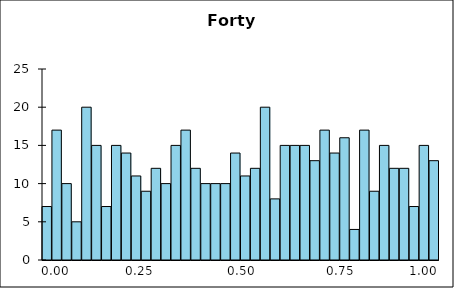
| Category | Series 1 |
|---|---|
| 0 | 7 |
| 1 | 17 |
| 2 | 10 |
| 3 | 5 |
| 4 | 20 |
| 5 | 15 |
| 6 | 7 |
| 7 | 15 |
| 8 | 14 |
| 9 | 11 |
| 10 | 9 |
| 11 | 12 |
| 12 | 10 |
| 13 | 15 |
| 14 | 17 |
| 15 | 12 |
| 16 | 10 |
| 17 | 10 |
| 18 | 10 |
| 19 | 14 |
| 20 | 11 |
| 21 | 12 |
| 22 | 20 |
| 23 | 8 |
| 24 | 15 |
| 25 | 15 |
| 26 | 15 |
| 27 | 13 |
| 28 | 17 |
| 29 | 14 |
| 30 | 16 |
| 31 | 4 |
| 32 | 17 |
| 33 | 9 |
| 34 | 15 |
| 35 | 12 |
| 36 | 12 |
| 37 | 7 |
| 38 | 15 |
| 39 | 13 |